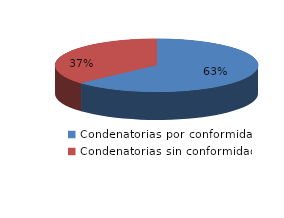
| Category | Series 0 |
|---|---|
| 0 | 8085 |
| 1 | 4692 |